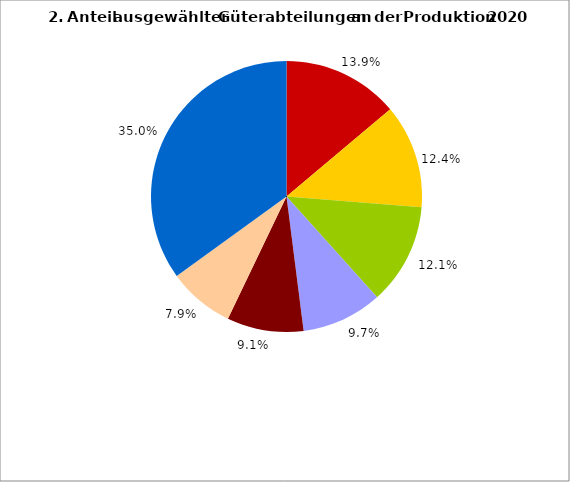
| Category | Series 0 |
|---|---|
| 0 | 13.873 |
| 1 | 12.402 |
| 2 | 12.069 |
| 3 | 9.638 |
| 4 | 9.136 |
| 5 | 7.914 |
| 6 | 34.967 |